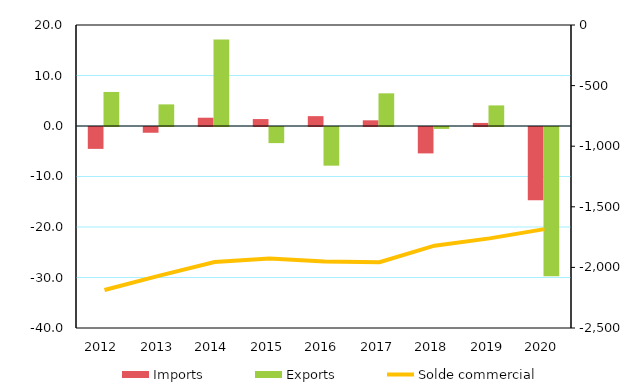
| Category | Imports | Exports |
|---|---|---|
| 2012 | -4.334 | 6.74 |
| 2013 | -1.14 | 4.281 |
| 2014 | 1.641 | 17.119 |
| 2015 | 1.374 | -3.193 |
| 2016 | 1.951 | -7.656 |
| 2017 | 1.126 | 6.47 |
| 2018 | -5.228 | -0.379 |
| 2019 | 0.609 | 4.079 |
| 2020 | -14.489 | -29.562 |